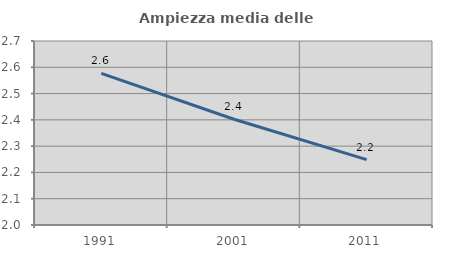
| Category | Ampiezza media delle famiglie |
|---|---|
| 1991.0 | 2.577 |
| 2001.0 | 2.402 |
| 2011.0 | 2.249 |